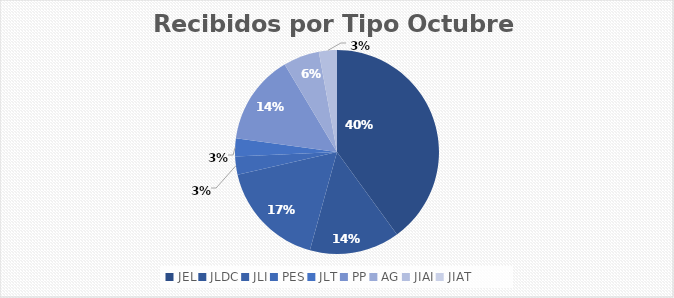
| Category | Series 0 |
|---|---|
| JEL | 14 |
| JLDC | 5 |
| JLI | 6 |
| PES | 1 |
| JLT | 1 |
| PP | 5 |
| AG | 2 |
| JIAI | 1 |
| JIAT | 0 |